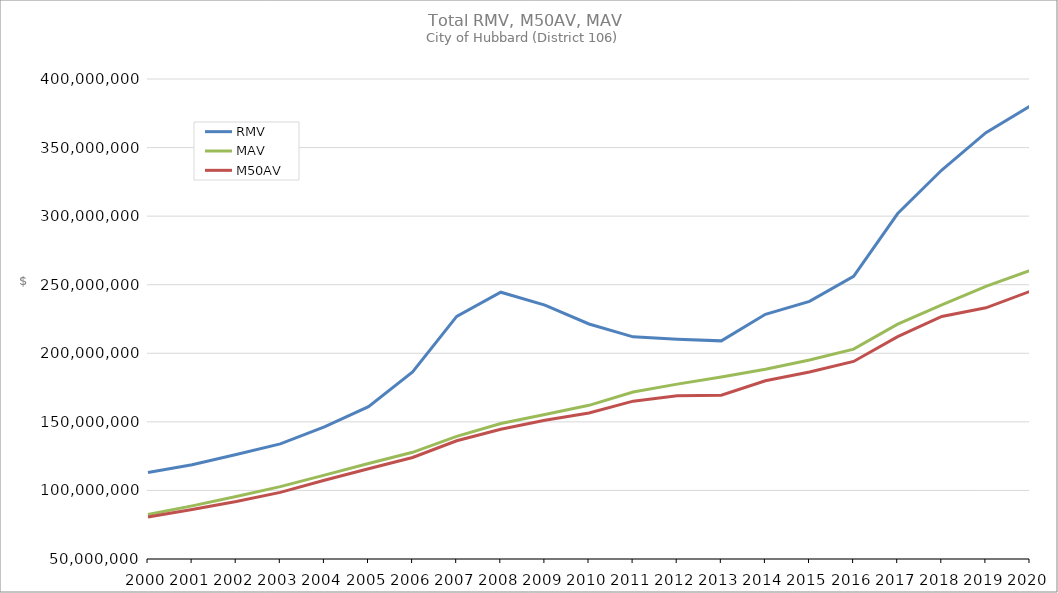
| Category | RMV | MAV | M50AV |
|---|---|---|---|
| 2000.0 | 113076821 | 82378767 | 80623891 |
| 2001.0 | 118715473 | 88746610 | 86101364 |
| 2002.0 | 126249933 | 95606979 | 91925699 |
| 2003.0 | 133950286 | 102764030 | 98553342 |
| 2004.0 | 146381456 | 111179328 | 107379800 |
| 2005.0 | 161050522 | 119599483 | 115754896 |
| 2006.0 | 186411654 | 127807949 | 124037477 |
| 2007.0 | 226947886 | 139436556 | 136231781 |
| 2008.0 | 244525862 | 148837221 | 144660778 |
| 2009.0 | 235085262 | 155394119 | 151098945 |
| 2010.0 | 221352930 | 162055993 | 156437174 |
| 2011.0 | 212004583 | 171714574 | 165097977 |
| 2012.0 | 210318912 | 177499567 | 169117999 |
| 2013.0 | 209052665 | 182776964 | 169469013 |
| 2014.0 | 228412912 | 188390207 | 179960771 |
| 2015.0 | 237813663 | 195072428 | 186316453 |
| 2016.0 | 256137220 | 203010028 | 194043822 |
| 2017.0 | 301917128 | 221269944 | 212096458 |
| 2018.0 | 333623679 | 235288670 | 226827818 |
| 2019.0 | 360846805 | 248847857 | 233134720 |
| 2020.0 | 380185298 | 260350352 | 245137128 |